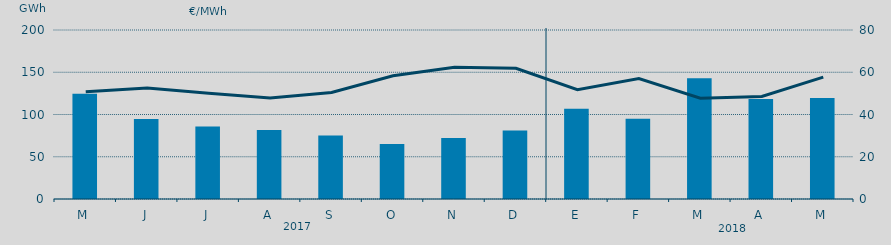
| Category | Energía a subir |
|---|---|
| M | 124663.514 |
| J | 94559.541 |
| J | 85673.202 |
| A | 81536.076 |
| S | 75102.289 |
| O | 65089.595 |
| N | 72290.07 |
| D | 81049.796 |
| E | 106846.751 |
| F | 95118.279 |
| M | 142766.358 |
| A | 118380.448 |
| M | 119519.43 |